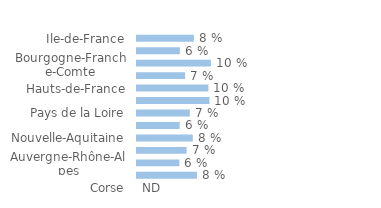
| Category | Series 0 |
|---|---|
| Ile-de-France | 0.077 |
| Centre-Val-de-Loire | 0.058 |
| Bourgogne-Franche-Comte | 0.1 |
| Normandie | 0.065 |
| Hauts-de-France | 0.097 |
| Grand-Est | 0.098 |
| Pays de la Loire | 0.072 |
| Bretagne | 0.058 |
| Nouvelle-Aquitaine | 0.076 |
| Occitanie | 0.067 |
| Auvergne-Rhône-Alpes | 0.058 |
| Provence-Alpes-Côte d'Azur | 0.081 |
| Corse | 0 |